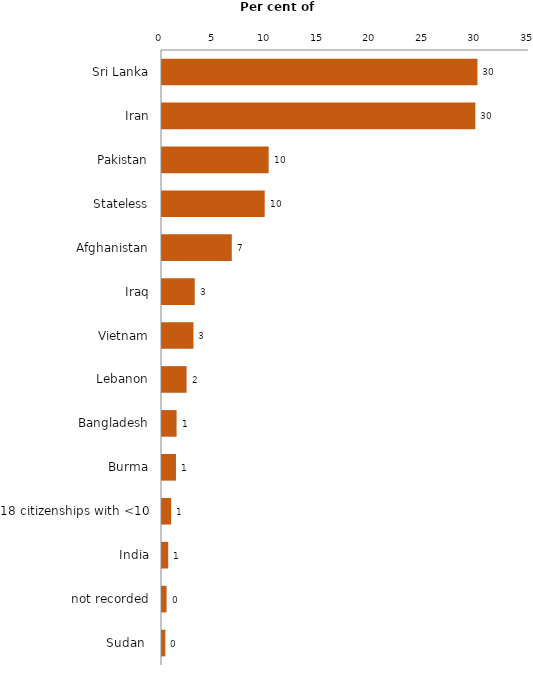
| Category | Citzenship |
|---|---|
| Sri Lanka | 30.081 |
| Iran | 29.883 |
| Pakistan | 10.173 |
| Stateless | 9.795 |
| Afghanistan | 6.656 |
| Iraq | 3.119 |
| Vietnam | 3 |
| Lebanon | 2.345 |
| Bangladesh | 1.391 |
| Burma | 1.331 |
| 18 citizenships with <10 | 0.874 |
| India | 0.596 |
| not recorded | 0.437 |
| Sudan  | 0.318 |